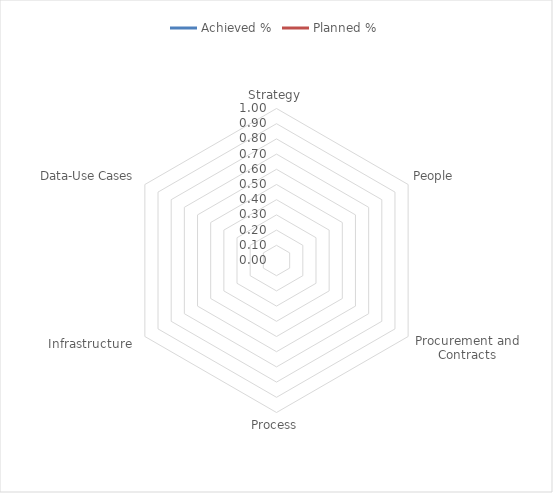
| Category | Achieved % | Planned % |
|---|---|---|
| Strategy | 0 | 0 |
| People | 0 | 0 |
| Procurement and Contracts | 0 | 0 |
| Process | 0 | 0 |
| Infrastructure  | 0 | 0 |
| Data-Use Cases | 0 | 0 |